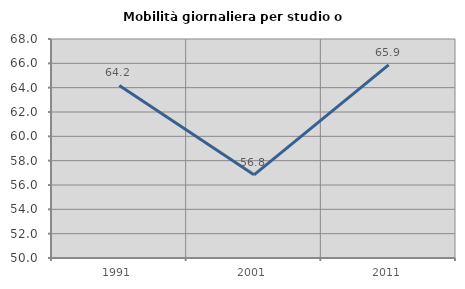
| Category | Mobilità giornaliera per studio o lavoro |
|---|---|
| 1991.0 | 64.181 |
| 2001.0 | 56.839 |
| 2011.0 | 65.87 |